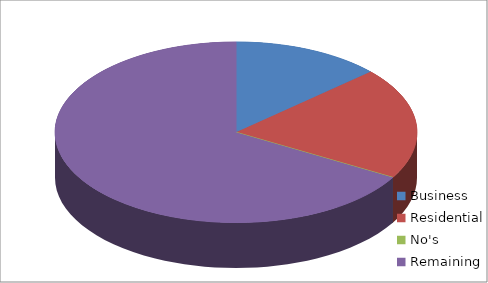
| Category | Series 0 |
|---|---|
| Business | 2 |
| Residential | 3 |
| No's | 0 |
| Remaining  | 10 |